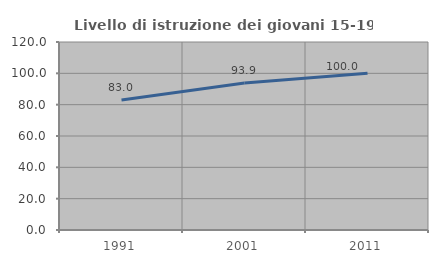
| Category | Livello di istruzione dei giovani 15-19 anni |
|---|---|
| 1991.0 | 83.019 |
| 2001.0 | 93.878 |
| 2011.0 | 100 |